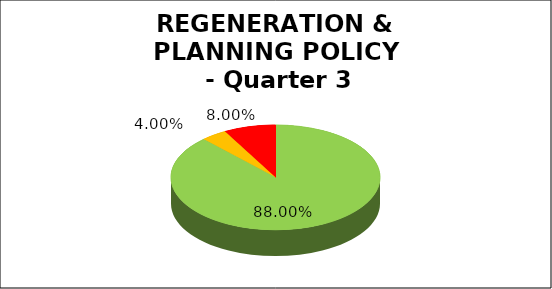
| Category | Q3 |
|---|---|
| Green | 0.88 |
| Amber | 0.04 |
| Red | 0.08 |